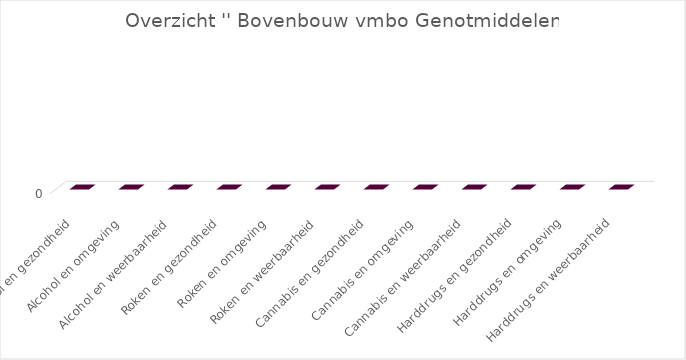
| Category | Series 2 |
|---|---|
| Alcohol en gezondheid | 0 |
| Alcohol en omgeving | 0 |
| Alcohol en weerbaarheid | 0 |
| Roken en gezondheid | 0 |
| Roken en omgeving | 0 |
| Roken en weerbaarheid | 0 |
| Cannabis en gezondheid | 0 |
| Cannabis en omgeving | 0 |
| Cannabis en weerbaarheid | 0 |
| Harddrugs en gezondheid | 0 |
| Harddrugs en omgeving | 0 |
| Harddrugs en weerbaarheid | 0 |